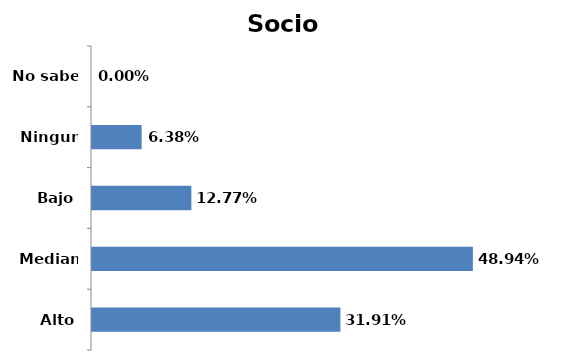
| Category | Series 0 |
|---|---|
| Alto | 0.319 |
| Mediano | 0.489 |
| Bajo | 0.128 |
| Ninguno | 0.064 |
| No sabe | 0 |